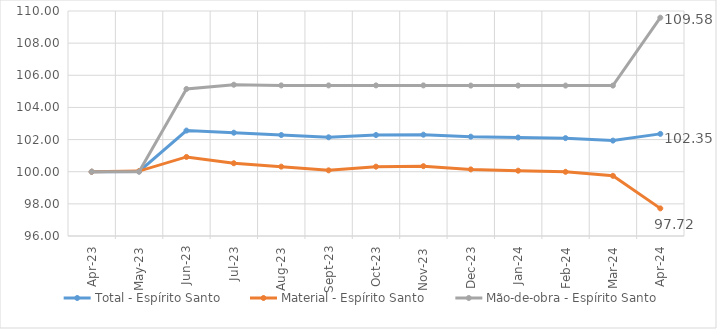
| Category | Total - Espírito Santo | Material - Espírito Santo | Mão-de-obra - Espírito Santo |
|---|---|---|---|
| 2023-04-01 | 100 | 100 | 100 |
| 2023-05-01 | 100.02 | 100.04 | 100 |
| 2023-06-01 | 102.56 | 100.919 | 105.15 |
| 2023-07-01 | 102.427 | 100.526 | 105.412 |
| 2023-08-01 | 102.283 | 100.316 | 105.37 |
| 2023-09-01 | 102.141 | 100.085 | 105.37 |
| 2023-10-01 | 102.283 | 100.314 | 105.37 |
| 2023-11-01 | 102.304 | 100.345 | 105.37 |
| 2023-12-01 | 102.181 | 100.144 | 105.36 |
| 2024-01-01 | 102.13 | 100.064 | 105.36 |
| 2024-02-01 | 102.09 | 99.995 | 105.36 |
| 2024-03-01 | 101.936 | 99.744 | 105.36 |
| 2024-04-01 | 102.354 | 97.719 | 109.585 |